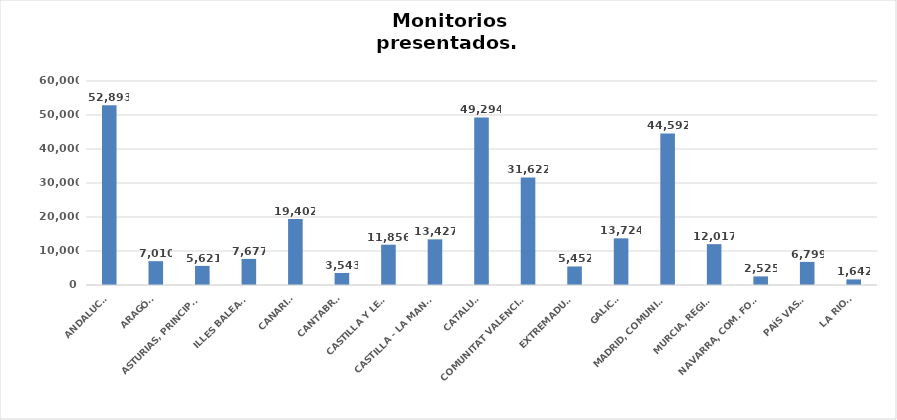
| Category | Series 0 |
|---|---|
| ANDALUCÍA | 52893 |
| ARAGÓN | 7010 |
| ASTURIAS, PRINCIPADO | 5621 |
| ILLES BALEARS | 7677 |
| CANARIAS | 19402 |
| CANTABRIA | 3543 |
| CASTILLA Y LEÓN | 11856 |
| CASTILLA - LA MANCHA | 13427 |
| CATALUÑA | 49294 |
| COMUNITAT VALENCIANA | 31622 |
| EXTREMADURA | 5452 |
| GALICIA | 13724 |
| MADRID, COMUNIDAD | 44592 |
| MURCIA, REGIÓN | 12017 |
| NAVARRA, COM. FORAL | 2525 |
| PAÍS VASCO | 6799 |
| LA RIOJA | 1642 |